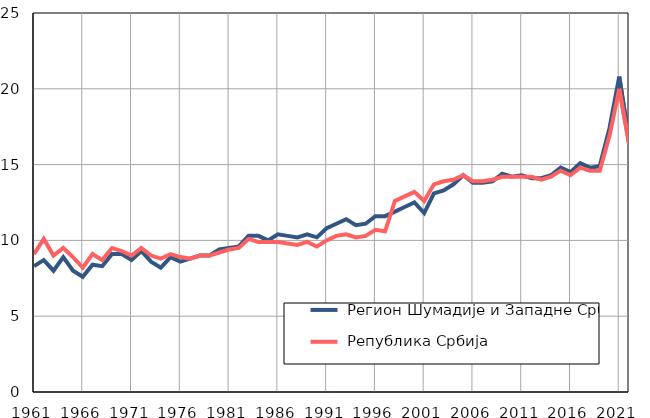
| Category |  Регион Шумадије и Западне Србије |  Република Србија |
|---|---|---|
| 1961.0 | 8.3 | 9.1 |
| 1962.0 | 8.7 | 10.1 |
| 1963.0 | 8 | 9 |
| 1964.0 | 8.9 | 9.5 |
| 1965.0 | 8 | 8.9 |
| 1966.0 | 7.6 | 8.2 |
| 1967.0 | 8.4 | 9.1 |
| 1968.0 | 8.3 | 8.7 |
| 1969.0 | 9.1 | 9.5 |
| 1970.0 | 9.1 | 9.3 |
| 1971.0 | 8.7 | 9 |
| 1972.0 | 9.3 | 9.5 |
| 1973.0 | 8.6 | 9 |
| 1974.0 | 8.2 | 8.8 |
| 1975.0 | 8.9 | 9.1 |
| 1976.0 | 8.6 | 8.9 |
| 1977.0 | 8.8 | 8.8 |
| 1978.0 | 9 | 9 |
| 1979.0 | 9 | 9 |
| 1980.0 | 9.4 | 9.2 |
| 1981.0 | 9.5 | 9.4 |
| 1982.0 | 9.6 | 9.5 |
| 1983.0 | 10.3 | 10.1 |
| 1984.0 | 10.3 | 9.9 |
| 1985.0 | 10 | 9.9 |
| 1986.0 | 10.4 | 9.9 |
| 1987.0 | 10.3 | 9.8 |
| 1988.0 | 10.2 | 9.7 |
| 1989.0 | 10.4 | 9.9 |
| 1990.0 | 10.2 | 9.6 |
| 1991.0 | 10.8 | 10 |
| 1992.0 | 11.1 | 10.3 |
| 1993.0 | 11.4 | 10.4 |
| 1994.0 | 11 | 10.2 |
| 1995.0 | 11.1 | 10.3 |
| 1996.0 | 11.6 | 10.7 |
| 1997.0 | 11.6 | 10.6 |
| 1998.0 | 11.9 | 12.6 |
| 1999.0 | 12.2 | 12.9 |
| 2000.0 | 12.5 | 13.2 |
| 2001.0 | 11.8 | 12.6 |
| 2002.0 | 13.1 | 13.7 |
| 2003.0 | 13.3 | 13.9 |
| 2004.0 | 13.7 | 14 |
| 2005.0 | 14.3 | 14.3 |
| 2006.0 | 13.8 | 13.9 |
| 2007.0 | 13.8 | 13.9 |
| 2008.0 | 13.9 | 14 |
| 2009.0 | 14.4 | 14.2 |
| 2010.0 | 14.2 | 14.2 |
| 2011.0 | 14.3 | 14.2 |
| 2012.0 | 14.1 | 14.2 |
| 2013.0 | 14.1 | 14 |
| 2014.0 | 14.3 | 14.2 |
| 2015.0 | 14.8 | 14.6 |
| 2016.0 | 14.5 | 14.3 |
| 2017.0 | 15.1 | 14.8 |
| 2018.0 | 14.8 | 14.6 |
| 2019.0 | 14.9 | 14.6 |
| 2020.0 | 17.4 | 16.9 |
| 2021.0 | 20.8 | 20 |
| 2022.0 | 16.6 | 16.4 |